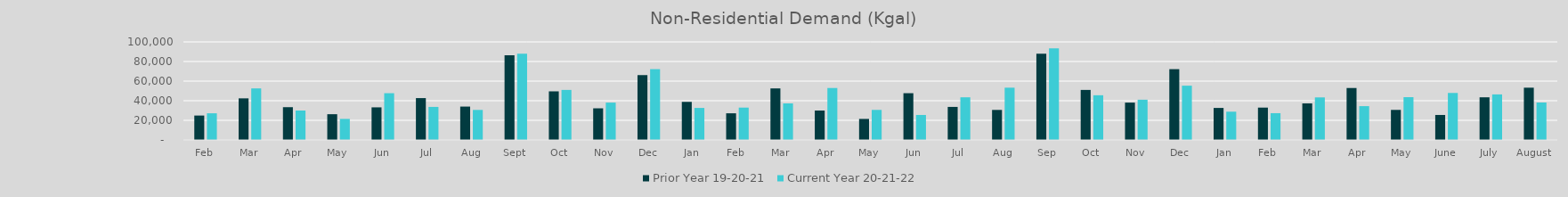
| Category | Prior Year 19-20-21 | Current Year 20-21-22 |
|---|---|---|
| Feb | 24891.705 | 27184.287 |
| Mar | 42416.796 | 52556.784 |
| Apr | 33427.881 | 30008.586 |
| May | 26254.448 | 21459.484 |
| Jun | 33248.873 | 47687.401 |
| Jul | 42679.938 | 33702.696 |
| Aug | 34036.498 | 30630.765 |
| Sep | 86367.775 | 87939.966 |
| Oct | 49561.754 | 51017.647 |
| Nov | 32261.42 | 38090.247 |
| Dec | 66164.871 | 72201.815 |
| Jan | 38851.995 | 32645.301 |
| Feb | 27184.287 | 32987.653 |
| Mar | 52556.784 | 37296.185 |
| Apr | 30008.586 | 52983.593 |
| May | 21459.484 | 30657.737 |
| Jun | 47687.401 | 25485.258 |
| Jul | 33702.696 | 43493.567 |
| Aug | 30630.765 | 53305.831 |
| Sep | 87939.966 | 93442.494 |
| Oct | 51017.647 | 45586.98 |
| Nov | 38090.247 | 41019.482 |
| Dec | 72201.815 | 55350.474 |
| Jan | 32645.301 | 28832.602 |
| Feb | 32987.653 | 27305.762 |
| Mar | 37296.185 | 43384.037 |
| Apr | 52983.593 | 34485.291 |
| May | 30657.737 | 43618.865 |
| June | 25485.258 | 47925.22 |
| July | 43493.567 | 46450.441 |
| August | 53305.831 | 38203.345 |